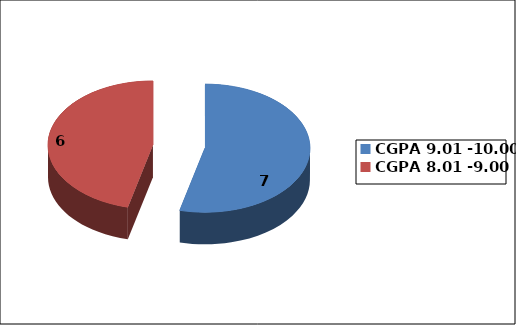
| Category | Series 0 |
|---|---|
| CGPA 9.01 -10.00 | 7 |
| CGPA 8.01 -9.00 | 6 |